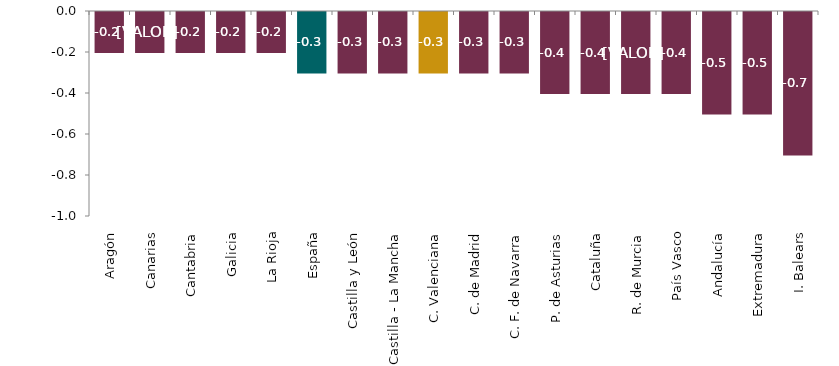
| Category | Series 0 |
|---|---|
| Aragón | -0.2 |
| Canarias | -0.2 |
| Cantabria | -0.2 |
| Galicia | -0.2 |
| La Rioja | -0.2 |
| España | -0.3 |
| Castilla y León | -0.3 |
| Castilla - La Mancha | -0.3 |
| C. Valenciana | -0.3 |
| C. de Madrid | -0.3 |
| C. F. de Navarra | -0.3 |
| P. de Asturias | -0.4 |
| Cataluña | -0.4 |
| R. de Murcia | -0.4 |
| País Vasco | -0.4 |
| Andalucía | -0.5 |
| Extremadura | -0.5 |
| I. Balears | -0.7 |